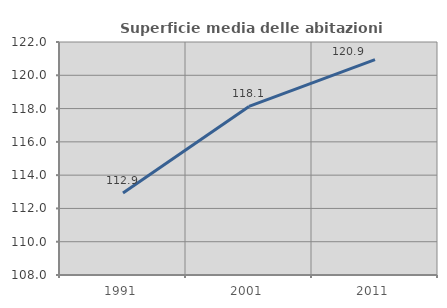
| Category | Superficie media delle abitazioni occupate |
|---|---|
| 1991.0 | 112.927 |
| 2001.0 | 118.126 |
| 2011.0 | 120.946 |